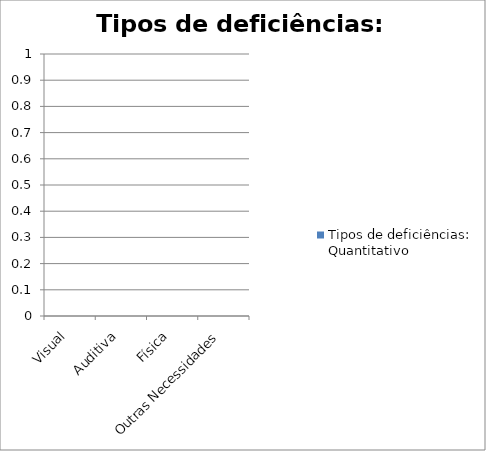
| Category | Tipos de deficiências: Quantitativo |
|---|---|
| Visual | 0 |
| Auditiva | 0 |
| Física | 0 |
| Outras Necessidades | 0 |